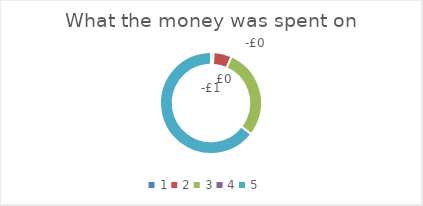
| Category | Series 0 |
|---|---|
| 0 | -0.018 |
| 1 | 0.128 |
| 2 | -0.633 |
| 3 | 0 |
| 4 | 1.414 |